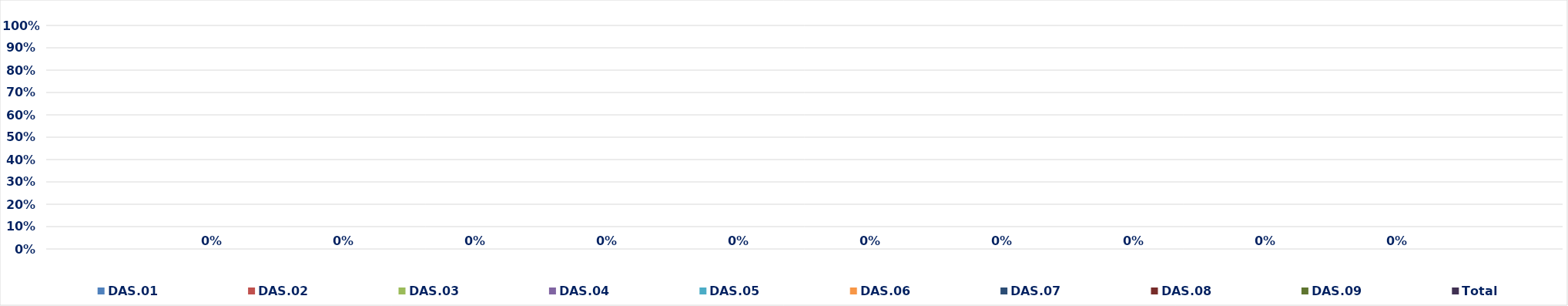
| Category | DAS.01 | DAS.02 | DAS.03 | DAS.04 | DAS.05 | DAS.06 | DAS.07 | DAS.08 | DAS.09 | Total |
|---|---|---|---|---|---|---|---|---|---|---|
| 0 | 0 | 0 | 0 | 0 | 0 | 0 | 0 | 0 | 0 | 0 |